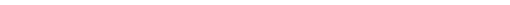
| Category | Series 0 |
|---|---|
| Space Heating | 54.936 |
| Space Cooling | 0 |